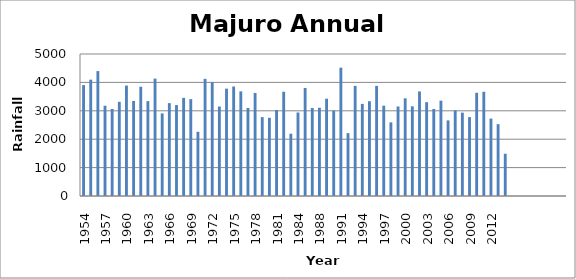
| Category | Series 0 |
|---|---|
| 1954.0 | 3904.764 |
| 1955.0 | 4096.2 |
| 1956.0 | 4399 |
| 1957.0 | 3179.5 |
| 1958.0 | 3063.1 |
| 1959.0 | 3316.8 |
| 1960.0 | 3888.5 |
| 1961.0 | 3346.4 |
| 1962.0 | 3846.3 |
| 1963.0 | 3341.1 |
| 1964.0 | 4133.5 |
| 1965.0 | 2908.3 |
| 1966.0 | 3270.4 |
| 1967.0 | 3202.3 |
| 1968.0 | 3456.1 |
| 1969.0 | 3410.9 |
| 1970.0 | 2261.1 |
| 1971.0 | 4125.9 |
| 1972.0 | 4005.5 |
| 1973.0 | 3151.2 |
| 1974.0 | 3780.2 |
| 1975.0 | 3855.4 |
| 1976.0 | 3684 |
| 1977.0 | 3100.3 |
| 1978.0 | 3628.3 |
| 1979.0 | 2777.8 |
| 1980.0 | 2754 |
| 1981.0 | 3027.9 |
| 1982.0 | 3671.4 |
| 1983.0 | 2193.1 |
| 1984.0 | 2939.8 |
| 1985.0 | 3804.4 |
| 1987.0 | 3098.3 |
| 1988.0 | 3107.2 |
| 1989.0 | 3426.2 |
| 1990.0 | 3005.7 |
| 1991.0 | 4519 |
| 1992.0 | 2212.9 |
| 1993.0 | 3877 |
| 1994.0 | 3243.4 |
| 1995.0 | 3337.2 |
| 1996.0 | 3876.9 |
| 1997.0 | 3181.3 |
| 1998.0 | 2593.2 |
| 1999.0 | 3152.1 |
| 2000.0 | 3439.6 |
| 2001.0 | 3157.5 |
| 2002.0 | 3682.7 |
| 2003.0 | 3304.3 |
| 2004.0 | 3063.5 |
| 2005.0 | 3358 |
| 2006.0 | 2661.7 |
| 2007.0 | 3015.3 |
| 2008.0 | 2934.7 |
| 2009.0 | 2777.1 |
| 2010.0 | 3634.7 |
| 2011.0 | 3669.8 |
| 2012.0 | 2725.8 |
| 2013.0 | 2529.8 |